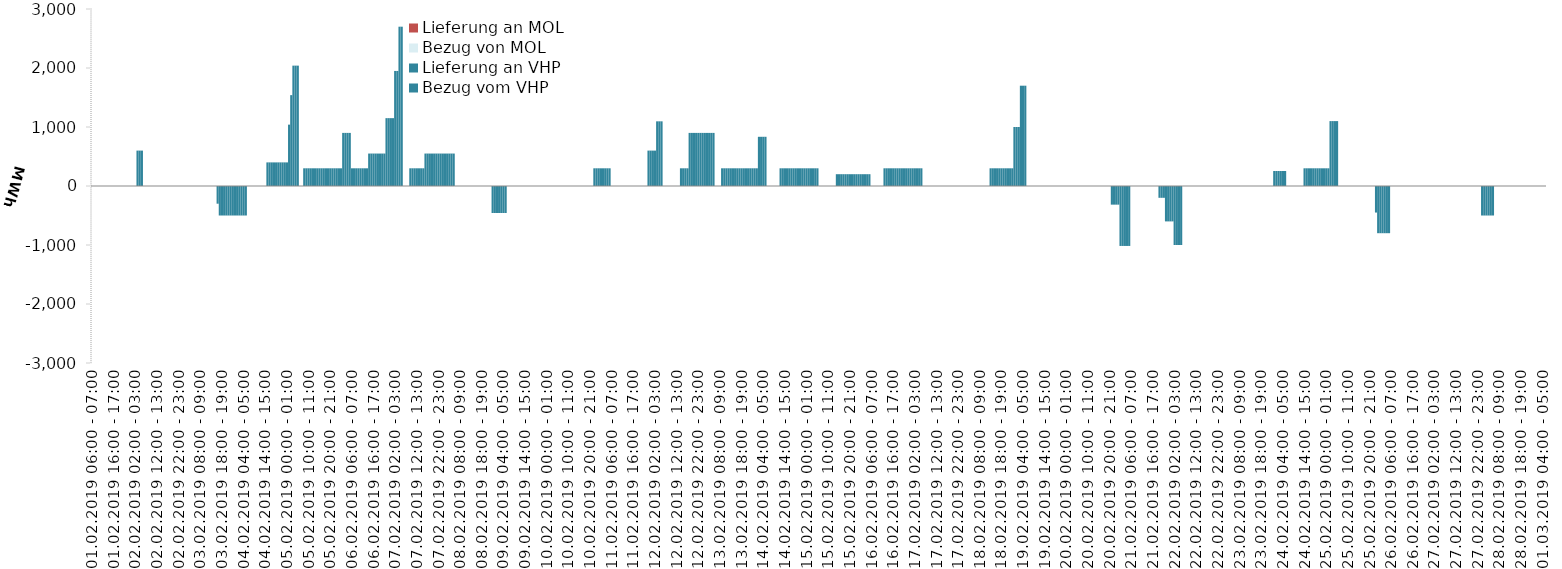
| Category | Bezug vom VHP | Lieferung an VHP | Bezug von MOL | Lieferung an MOL |
|---|---|---|---|---|
| 01.02.2019 06:00 - 07:00 | 0 | 0 | 0 | 0 |
| 01.02.2019 07:00 - 08:00 | 0 | 0 | 0 | 0 |
| 01.02.2019 08:00 - 09:00 | 0 | 0 | 0 | 0 |
| 01.02.2019 09:00 - 10:00 | 0 | 0 | 0 | 0 |
| 01.02.2019 10:00 - 11:00 | 0 | 0 | 0 | 0 |
| 01.02.2019 11:00 - 12:00 | 0 | 0 | 0 | 0 |
| 01.02.2019 12:00 - 13:00 | 0 | 0 | 0 | 0 |
| 01.02.2019 13:00 - 14:00 | 0 | 0 | 0 | 0 |
| 01.02.2019 14:00 - 15:00 | 0 | 0 | 0 | 0 |
| 01.02.2019 15:00 - 16:00 | 0 | 0 | 0 | 0 |
| 01.02.2019 16:00 - 17:00 | 0 | 0 | 0 | 0 |
| 01.02.2019 17:00 - 18:00 | 0 | 0 | 0 | 0 |
| 01.02.2019 18:00 - 19:00 | 0 | 0 | 0 | 0 |
| 01.02.2019 19:00 - 20:00 | 0 | 0 | 0 | 0 |
| 01.02.2019 20:00 - 21:00 | 0 | 0 | 0 | 0 |
| 01.02.2019 21:00 - 22:00 | 0 | 0 | 0 | 0 |
| 01.02.2019 22:00 - 23:00 | 0 | 0 | 0 | 0 |
| 01.02.2019 23:00 - 24:00 | 0 | 0 | 0 | 0 |
| 02.02.2019 00:00 - 01:00 | 0 | 0 | 0 | 0 |
| 02.02.2019 01:00 - 02:00 | 0 | 0 | 0 | 0 |
| 02.02.2019 02:00 - 03:00 | 0 | 0 | 0 | 0 |
| 02.02.2019 03:00 - 04:00 | 600 | 0 | 0 | 0 |
| 02.02.2019 04:00 - 05:00 | 600 | 0 | 0 | 0 |
| 02.02.2019 05:00 - 06:00 | 600 | 0 | 0 | 0 |
| 02.02.2019 06:00 - 07:00 | 0 | 0 | 0 | 0 |
| 02.02.2019 07:00 - 08:00 | 0 | 0 | 0 | 0 |
| 02.02.2019 08:00 - 09:00 | 0 | 0 | 0 | 0 |
| 02.02.2019 09:00 - 10:00 | 0 | 0 | 0 | 0 |
| 02.02.2019 10:00 - 11:00 | 0 | 0 | 0 | 0 |
| 02.02.2019 11:00 - 12:00 | 0 | 0 | 0 | 0 |
| 02.02.2019 12:00 - 13:00 | 0 | 0 | 0 | 0 |
| 02.02.2019 13:00 - 14:00 | 0 | 0 | 0 | 0 |
| 02.02.2019 14:00 - 15:00 | 0 | 0 | 0 | 0 |
| 02.02.2019 15:00 - 16:00 | 0 | 0 | 0 | 0 |
| 02.02.2019 16:00 - 17:00 | 0 | 0 | 0 | 0 |
| 02.02.2019 17:00 - 18:00 | 0 | 0 | 0 | 0 |
| 02.02.2019 18:00 - 19:00 | 0 | 0 | 0 | 0 |
| 02.02.2019 19:00 - 20:00 | 0 | 0 | 0 | 0 |
| 02.02.2019 20:00 - 21:00 | 0 | 0 | 0 | 0 |
| 02.02.2019 21:00 - 22:00 | 0 | 0 | 0 | 0 |
| 02.02.2019 22:00 - 23:00 | 0 | 0 | 0 | 0 |
| 02.02.2019 23:00 - 24:00 | 0 | 0 | 0 | 0 |
| 03.02.2019 00:00 - 01:00 | 0 | 0 | 0 | 0 |
| 03.02.2019 01:00 - 02:00 | 0 | 0 | 0 | 0 |
| 03.02.2019 02:00 - 03:00 | 0 | 0 | 0 | 0 |
| 03.02.2019 03:00 - 04:00 | 0 | 0 | 0 | 0 |
| 03.02.2019 04:00 - 05:00 | 0 | 0 | 0 | 0 |
| 03.02.2019 05:00 - 06:00 | 0 | 0 | 0 | 0 |
| 03.02.2019 06:00 - 07:00 | 0 | 0 | 0 | 0 |
| 03.02.2019 07:00 - 08:00 | 0 | 0 | 0 | 0 |
| 03.02.2019 08:00 - 09:00 | 0 | 0 | 0 | 0 |
| 03.02.2019 09:00 - 10:00 | 0 | 0 | 0 | 0 |
| 03.02.2019 10:00 - 11:00 | 0 | 0 | 0 | 0 |
| 03.02.2019 11:00 - 12:00 | 0 | 0 | 0 | 0 |
| 03.02.2019 12:00 - 13:00 | 0 | 0 | 0 | 0 |
| 03.02.2019 13:00 - 14:00 | 0 | 0 | 0 | 0 |
| 03.02.2019 14:00 - 15:00 | 0 | 0 | 0 | 0 |
| 03.02.2019 15:00 - 16:00 | 0 | 0 | 0 | 0 |
| 03.02.2019 16:00 - 17:00 | 0 | -300 | 0 | 0 |
| 03.02.2019 17:00 - 18:00 | 0 | -500 | 0 | 0 |
| 03.02.2019 18:00 - 19:00 | 0 | -500 | 0 | 0 |
| 03.02.2019 19:00 - 20:00 | 0 | -500 | 0 | 0 |
| 03.02.2019 20:00 - 21:00 | 0 | -500 | 0 | 0 |
| 03.02.2019 21:00 - 22:00 | 0 | -500 | 0 | 0 |
| 03.02.2019 22:00 - 23:00 | 0 | -500 | 0 | 0 |
| 03.02.2019 23:00 - 24:00 | 0 | -500 | 0 | 0 |
| 04.02.2019 00:00 - 01:00 | 0 | -500 | 0 | 0 |
| 04.02.2019 01:00 - 02:00 | 0 | -500 | 0 | 0 |
| 04.02.2019 02:00 - 03:00 | 0 | -500 | 0 | 0 |
| 04.02.2019 03:00 - 04:00 | 0 | -500 | 0 | 0 |
| 04.02.2019 04:00 - 05:00 | 0 | -500 | 0 | 0 |
| 04.02.2019 05:00 - 06:00 | 0 | -500 | 0 | 0 |
| 04.02.2019 06:00 - 07:00 | 0 | 0 | 0 | 0 |
| 04.02.2019 07:00 - 08:00 | 0 | 0 | 0 | 0 |
| 04.02.2019 08:00 - 09:00 | 0 | 0 | 0 | 0 |
| 04.02.2019 09:00 - 10:00 | 0 | 0 | 0 | 0 |
| 04.02.2019 10:00 - 11:00 | 0 | 0 | 0 | 0 |
| 04.02.2019 11:00 - 12:00 | 0 | 0 | 0 | 0 |
| 04.02.2019 12:00 - 13:00 | 0 | 0 | 0 | 0 |
| 04.02.2019 13:00 - 14:00 | 0 | 0 | 0 | 0 |
| 04.02.2019 14:00 - 15:00 | 0 | 0 | 0 | 0 |
| 04.02.2019 15:00 - 16:00 | 400 | 0 | 0 | 0 |
| 04.02.2019 16:00 - 17:00 | 400 | 0 | 0 | 0 |
| 04.02.2019 17:00 - 18:00 | 400 | 0 | 0 | 0 |
| 04.02.2019 18:00 - 19:00 | 400 | 0 | 0 | 0 |
| 04.02.2019 19:00 - 20:00 | 400 | 0 | 0 | 0 |
| 04.02.2019 20:00 - 21:00 | 400 | 0 | 0 | 0 |
| 04.02.2019 21:00 - 22:00 | 400 | 0 | 0 | 0 |
| 04.02.2019 22:00 - 23:00 | 400 | 0 | 0 | 0 |
| 04.02.2019 23:00 - 24:00 | 400 | 0 | 0 | 0 |
| 05.02.2019 00:00 - 01:00 | 400 | 0 | 0 | 0 |
| 05.02.2019 01:00 - 02:00 | 1040 | 0 | 0 | 0 |
| 05.02.2019 02:00 - 03:00 | 1540 | 0 | 0 | 0 |
| 05.02.2019 03:00 - 04:00 | 2040 | 0 | 0 | 0 |
| 05.02.2019 04:00 - 05:00 | 2040 | 0 | 0 | 0 |
| 05.02.2019 05:00 - 06:00 | 2040 | 0 | 0 | 0 |
| 05.02.2019 06:00 - 07:00 | 0 | 0 | 0 | 0 |
| 05.02.2019 07:00 - 08:00 | 0 | 0 | 0 | 0 |
| 05.02.2019 08:00 - 09:00 | 300 | 0 | 0 | 0 |
| 05.02.2019 09:00 - 10:00 | 300 | 0 | 0 | 0 |
| 05.02.2019 10:00 - 11:00 | 300 | 0 | 0 | 0 |
| 05.02.2019 11:00 - 12:00 | 300 | 0 | 0 | 0 |
| 05.02.2019 12:00 - 13:00 | 300 | 0 | 0 | 0 |
| 05.02.2019 13:00 - 14:00 | 300 | 0 | 0 | 0 |
| 05.02.2019 14:00 - 15:00 | 300 | 0 | 0 | 0 |
| 05.02.2019 15:00 - 16:00 | 300 | 0 | 0 | 0 |
| 05.02.2019 16:00 - 17:00 | 300 | 0 | 0 | 0 |
| 05.02.2019 17:00 - 18:00 | 300 | 0 | 0 | 0 |
| 05.02.2019 18:00 - 19:00 | 300 | 0 | 0 | 0 |
| 05.02.2019 19:00 - 20:00 | 300 | 0 | 0 | 0 |
| 05.02.2019 20:00 - 21:00 | 300 | 0 | 0 | 0 |
| 05.02.2019 21:00 - 22:00 | 300 | 0 | 0 | 0 |
| 05.02.2019 22:00 - 23:00 | 300 | 0 | 0 | 0 |
| 05.02.2019 23:00 - 24:00 | 300 | 0 | 0 | 0 |
| 06.02.2019 00:00 - 01:00 | 300 | 0 | 0 | 0 |
| 06.02.2019 01:00 - 02:00 | 300 | 0 | 0 | 0 |
| 06.02.2019 02:00 - 03:00 | 900 | 0 | 0 | 0 |
| 06.02.2019 03:00 - 04:00 | 900 | 0 | 0 | 0 |
| 06.02.2019 04:00 - 05:00 | 900 | 0 | 0 | 0 |
| 06.02.2019 05:00 - 06:00 | 900 | 0 | 0 | 0 |
| 06.02.2019 06:00 - 07:00 | 300 | 0 | 0 | 0 |
| 06.02.2019 07:00 - 08:00 | 300 | 0 | 0 | 0 |
| 06.02.2019 08:00 - 09:00 | 300 | 0 | 0 | 0 |
| 06.02.2019 09:00 - 10:00 | 300 | 0 | 0 | 0 |
| 06.02.2019 10:00 - 11:00 | 300 | 0 | 0 | 0 |
| 06.02.2019 11:00 - 12:00 | 300 | 0 | 0 | 0 |
| 06.02.2019 12:00 - 13:00 | 300 | 0 | 0 | 0 |
| 06.02.2019 13:00 - 14:00 | 300 | 0 | 0 | 0 |
| 06.02.2019 14:00 - 15:00 | 550 | 0 | 0 | 0 |
| 06.02.2019 15:00 - 16:00 | 550 | 0 | 0 | 0 |
| 06.02.2019 16:00 - 17:00 | 550 | 0 | 0 | 0 |
| 06.02.2019 17:00 - 18:00 | 550 | 0 | 0 | 0 |
| 06.02.2019 18:00 - 19:00 | 550 | 0 | 0 | 0 |
| 06.02.2019 19:00 - 20:00 | 550 | 0 | 0 | 0 |
| 06.02.2019 20:00 - 21:00 | 550 | 0 | 0 | 0 |
| 06.02.2019 21:00 - 22:00 | 550 | 0 | 0 | 0 |
| 06.02.2019 22:00 - 23:00 | 1150 | 0 | 0 | 0 |
| 06.02.2019 23:00 - 24:00 | 1150 | 0 | 0 | 0 |
| 07.02.2019 00:00 - 01:00 | 1150 | 0 | 0 | 0 |
| 07.02.2019 01:00 - 02:00 | 1150 | 0 | 0 | 0 |
| 07.02.2019 02:00 - 03:00 | 1950 | 0 | 0 | 0 |
| 07.02.2019 03:00 - 04:00 | 1950 | 0 | 0 | 0 |
| 07.02.2019 04:00 - 05:00 | 2700 | 0 | 0 | 0 |
| 07.02.2019 05:00 - 06:00 | 2700 | 0 | 0 | 0 |
| 07.02.2019 06:00 - 07:00 | 0 | 0 | 0 | 0 |
| 07.02.2019 07:00 - 08:00 | 0 | 0 | 0 | 0 |
| 07.02.2019 08:00 - 09:00 | 0 | 0 | 0 | 0 |
| 07.02.2019 09:00 - 10:00 | 300 | 0 | 0 | 0 |
| 07.02.2019 10:00 - 11:00 | 300 | 0 | 0 | 0 |
| 07.02.2019 11:00 - 12:00 | 300 | 0 | 0 | 0 |
| 07.02.2019 12:00 - 13:00 | 300 | 0 | 0 | 0 |
| 07.02.2019 13:00 - 14:00 | 300 | 0 | 0 | 0 |
| 07.02.2019 14:00 - 15:00 | 300 | 0 | 0 | 0 |
| 07.02.2019 15:00 - 16:00 | 300 | 0 | 0 | 0 |
| 07.02.2019 16:00 - 17:00 | 550 | 0 | 0 | 0 |
| 07.02.2019 17:00 - 18:00 | 550 | 0 | 0 | 0 |
| 07.02.2019 18:00 - 19:00 | 550 | 0 | 0 | 0 |
| 07.02.2019 19:00 - 20:00 | 550 | 0 | 0 | 0 |
| 07.02.2019 20:00 - 21:00 | 550 | 0 | 0 | 0 |
| 07.02.2019 21:00 - 22:00 | 550 | 0 | 0 | 0 |
| 07.02.2019 22:00 - 23:00 | 550 | 0 | 0 | 0 |
| 07.02.2019 23:00 - 24:00 | 550 | 0 | 0 | 0 |
| 08.02.2019 00:00 - 01:00 | 550 | 0 | 0 | 0 |
| 08.02.2019 01:00 - 02:00 | 550 | 0 | 0 | 0 |
| 08.02.2019 02:00 - 03:00 | 550 | 0 | 0 | 0 |
| 08.02.2019 03:00 - 04:00 | 550 | 0 | 0 | 0 |
| 08.02.2019 04:00 - 05:00 | 550 | 0 | 0 | 0 |
| 08.02.2019 05:00 - 06:00 | 550 | 0 | 0 | 0 |
| 08.02.2019 06:00 - 07:00 | 0 | 0 | 0 | 0 |
| 08.02.2019 07:00 - 08:00 | 0 | 0 | 0 | 0 |
| 08.02.2019 08:00 - 09:00 | 0 | 0 | 0 | 0 |
| 08.02.2019 09:00 - 10:00 | 0 | 0 | 0 | 0 |
| 08.02.2019 10:00 - 11:00 | 0 | 0 | 0 | 0 |
| 08.02.2019 11:00 - 12:00 | 0 | 0 | 0 | 0 |
| 08.02.2019 12:00 - 13:00 | 0 | 0 | 0 | 0 |
| 08.02.2019 13:00 - 14:00 | 0 | 0 | 0 | 0 |
| 08.02.2019 14:00 - 15:00 | 0 | 0 | 0 | 0 |
| 08.02.2019 15:00 - 16:00 | 0 | 0 | 0 | 0 |
| 08.02.2019 16:00 - 17:00 | 0 | 0 | 0 | 0 |
| 08.02.2019 17:00 - 18:00 | 0 | 0 | 0 | 0 |
| 08.02.2019 18:00 - 19:00 | 0 | 0 | 0 | 0 |
| 08.02.2019 19:00 - 20:00 | 0 | 0 | 0 | 0 |
| 08.02.2019 20:00 - 21:00 | 0 | 0 | 0 | 0 |
| 08.02.2019 21:00 - 22:00 | 0 | 0 | 0 | 0 |
| 08.02.2019 22:00 - 23:00 | 0 | 0 | 0 | 0 |
| 08.02.2019 23:00 - 24:00 | 0 | -458 | 0 | 0 |
| 09.02.2019 00:00 - 01:00 | 0 | -458 | 0 | 0 |
| 09.02.2019 01:00 - 02:00 | 0 | -458 | 0 | 0 |
| 09.02.2019 02:00 - 03:00 | 0 | -458 | 0 | 0 |
| 09.02.2019 03:00 - 04:00 | 0 | -458 | 0 | 0 |
| 09.02.2019 04:00 - 05:00 | 0 | -458 | 0 | 0 |
| 09.02.2019 05:00 - 06:00 | 0 | -458 | 0 | 0 |
| 09.02.2019 06:00 - 07:00 | 0 | 0 | 0 | 0 |
| 09.02.2019 07:00 - 08:00 | 0 | 0 | 0 | 0 |
| 09.02.2019 08:00 - 09:00 | 0 | 0 | 0 | 0 |
| 09.02.2019 09:00 - 10:00 | 0 | 0 | 0 | 0 |
| 09.02.2019 10:00 - 11:00 | 0 | 0 | 0 | 0 |
| 09.02.2019 11:00 - 12:00 | 0 | 0 | 0 | 0 |
| 09.02.2019 12:00 - 13:00 | 0 | 0 | 0 | 0 |
| 09.02.2019 13:00 - 14:00 | 0 | 0 | 0 | 0 |
| 09.02.2019 14:00 - 15:00 | 0 | 0 | 0 | 0 |
| 09.02.2019 15:00 - 16:00 | 0 | 0 | 0 | 0 |
| 09.02.2019 16:00 - 17:00 | 0 | 0 | 0 | 0 |
| 09.02.2019 17:00 - 18:00 | 0 | 0 | 0 | 0 |
| 09.02.2019 18:00 - 19:00 | 0 | 0 | 0 | 0 |
| 09.02.2019 19:00 - 20:00 | 0 | 0 | 0 | 0 |
| 09.02.2019 20:00 - 21:00 | 0 | 0 | 0 | 0 |
| 09.02.2019 21:00 - 22:00 | 0 | 0 | 0 | 0 |
| 09.02.2019 22:00 - 23:00 | 0 | 0 | 0 | 0 |
| 09.02.2019 23:00 - 24:00 | 0 | 0 | 0 | 0 |
| 10.02.2019 00:00 - 01:00 | 0 | 0 | 0 | 0 |
| 10.02.2019 01:00 - 02:00 | 0 | 0 | 0 | 0 |
| 10.02.2019 02:00 - 03:00 | 0 | 0 | 0 | 0 |
| 10.02.2019 03:00 - 04:00 | 0 | 0 | 0 | 0 |
| 10.02.2019 04:00 - 05:00 | 0 | 0 | 0 | 0 |
| 10.02.2019 05:00 - 06:00 | 0 | 0 | 0 | 0 |
| 10.02.2019 06:00 - 07:00 | 0 | 0 | 0 | 0 |
| 10.02.2019 07:00 - 08:00 | 0 | 0 | 0 | 0 |
| 10.02.2019 08:00 - 09:00 | 0 | 0 | 0 | 0 |
| 10.02.2019 09:00 - 10:00 | 0 | 0 | 0 | 0 |
| 10.02.2019 10:00 - 11:00 | 0 | 0 | 0 | 0 |
| 10.02.2019 11:00 - 12:00 | 0 | 0 | 0 | 0 |
| 10.02.2019 12:00 - 13:00 | 0 | 0 | 0 | 0 |
| 10.02.2019 13:00 - 14:00 | 0 | 0 | 0 | 0 |
| 10.02.2019 14:00 - 15:00 | 0 | 0 | 0 | 0 |
| 10.02.2019 15:00 - 16:00 | 0 | 0 | 0 | 0 |
| 10.02.2019 16:00 - 17:00 | 0 | 0 | 0 | 0 |
| 10.02.2019 17:00 - 18:00 | 0 | 0 | 0 | 0 |
| 10.02.2019 18:00 - 19:00 | 0 | 0 | 0 | 0 |
| 10.02.2019 19:00 - 20:00 | 0 | 0 | 0 | 0 |
| 10.02.2019 20:00 - 21:00 | 0 | 0 | 0 | 0 |
| 10.02.2019 21:00 - 22:00 | 0 | 0 | 0 | 0 |
| 10.02.2019 22:00 - 23:00 | 300 | 0 | 0 | 0 |
| 10.02.2019 23:00 - 24:00 | 300 | 0 | 0 | 0 |
| 11.02.2019 00:00 - 01:00 | 300 | 0 | 0 | 0 |
| 11.02.2019 01:00 - 02:00 | 300 | 0 | 0 | 0 |
| 11.02.2019 02:00 - 03:00 | 300 | 0 | 0 | 0 |
| 11.02.2019 03:00 - 04:00 | 300 | 0 | 0 | 0 |
| 11.02.2019 04:00 - 05:00 | 300 | 0 | 0 | 0 |
| 11.02.2019 05:00 - 06:00 | 300 | 0 | 0 | 0 |
| 11.02.2019 06:00 - 07:00 | 0 | 0 | 0 | 0 |
| 11.02.2019 07:00 - 08:00 | 0 | 0 | 0 | 0 |
| 11.02.2019 08:00 - 09:00 | 0 | 0 | 0 | 0 |
| 11.02.2019 09:00 - 10:00 | 0 | 0 | 0 | 0 |
| 11.02.2019 10:00 - 11:00 | 0 | 0 | 0 | 0 |
| 11.02.2019 11:00 - 12:00 | 0 | 0 | 0 | 0 |
| 11.02.2019 12:00 - 13:00 | 0 | 0 | 0 | 0 |
| 11.02.2019 13:00 - 14:00 | 0 | 0 | 0 | 0 |
| 11.02.2019 14:00 - 15:00 | 0 | 0 | 0 | 0 |
| 11.02.2019 15:00 - 16:00 | 0 | 0 | 0 | 0 |
| 11.02.2019 16:00 - 17:00 | 0 | 0 | 0 | 0 |
| 11.02.2019 17:00 - 18:00 | 0 | 0 | 0 | 0 |
| 11.02.2019 18:00 - 19:00 | 0 | 0 | 0 | 0 |
| 11.02.2019 19:00 - 20:00 | 0 | 0 | 0 | 0 |
| 11.02.2019 20:00 - 21:00 | 0 | 0 | 0 | 0 |
| 11.02.2019 21:00 - 22:00 | 0 | 0 | 0 | 0 |
| 11.02.2019 22:00 - 23:00 | 0 | 0 | 0 | 0 |
| 11.02.2019 23:00 - 24:00 | 600 | 0 | 0 | 0 |
| 12.02.2019 00:00 - 01:00 | 600 | 0 | 0 | 0 |
| 12.02.2019 01:00 - 02:00 | 600 | 0 | 0 | 0 |
| 12.02.2019 02:00 - 03:00 | 600 | 0 | 0 | 0 |
| 12.02.2019 03:00 - 04:00 | 1096 | 0 | 0 | 0 |
| 12.02.2019 04:00 - 05:00 | 1096 | 0 | 0 | 0 |
| 12.02.2019 05:00 - 06:00 | 1096 | 0 | 0 | 0 |
| 12.02.2019 06:00 - 07:00 | 0 | 0 | 0 | 0 |
| 12.02.2019 07:00 - 08:00 | 0 | 0 | 0 | 0 |
| 12.02.2019 08:00 - 09:00 | 0 | 0 | 0 | 0 |
| 12.02.2019 09:00 - 10:00 | 0 | 0 | 0 | 0 |
| 12.02.2019 10:00 - 11:00 | 0 | 0 | 0 | 0 |
| 12.02.2019 11:00 - 12:00 | 0 | 0 | 0 | 0 |
| 12.02.2019 12:00 - 13:00 | 0 | 0 | 0 | 0 |
| 12.02.2019 13:00 - 14:00 | 0 | 0 | 0 | 0 |
| 12.02.2019 14:00 - 15:00 | 300 | 0 | 0 | 0 |
| 12.02.2019 15:00 - 16:00 | 300 | 0 | 0 | 0 |
| 12.02.2019 16:00 - 17:00 | 300 | 0 | 0 | 0 |
| 12.02.2019 17:00 - 18:00 | 300 | 0 | 0 | 0 |
| 12.02.2019 18:00 - 19:00 | 900 | 0 | 0 | 0 |
| 12.02.2019 19:00 - 20:00 | 900 | 0 | 0 | 0 |
| 12.02.2019 20:00 - 21:00 | 900 | 0 | 0 | 0 |
| 12.02.2019 21:00 - 22:00 | 900 | 0 | 0 | 0 |
| 12.02.2019 22:00 - 23:00 | 900 | 0 | 0 | 0 |
| 12.02.2019 23:00 - 24:00 | 900 | 0 | 0 | 0 |
| 13.02.2019 00:00 - 01:00 | 900 | 0 | 0 | 0 |
| 13.02.2019 01:00 - 02:00 | 900 | 0 | 0 | 0 |
| 13.02.2019 02:00 - 03:00 | 900 | 0 | 0 | 0 |
| 13.02.2019 03:00 - 04:00 | 900 | 0 | 0 | 0 |
| 13.02.2019 04:00 - 05:00 | 900 | 0 | 0 | 0 |
| 13.02.2019 05:00 - 06:00 | 900 | 0 | 0 | 0 |
| 13.02.2019 06:00 - 07:00 | 0 | 0 | 0 | 0 |
| 13.02.2019 07:00 - 08:00 | 0 | 0 | 0 | 0 |
| 13.02.2019 08:00 - 09:00 | 0 | 0 | 0 | 0 |
| 13.02.2019 09:00 - 10:00 | 300 | 0 | 0 | 0 |
| 13.02.2019 10:00 - 11:00 | 300 | 0 | 0 | 0 |
| 13.02.2019 11:00 - 12:00 | 300 | 0 | 0 | 0 |
| 13.02.2019 12:00 - 13:00 | 300 | 0 | 0 | 0 |
| 13.02.2019 13:00 - 14:00 | 300 | 0 | 0 | 0 |
| 13.02.2019 14:00 - 15:00 | 300 | 0 | 0 | 0 |
| 13.02.2019 15:00 - 16:00 | 300 | 0 | 0 | 0 |
| 13.02.2019 16:00 - 17:00 | 300 | 0 | 0 | 0 |
| 13.02.2019 17:00 - 18:00 | 300 | 0 | 0 | 0 |
| 13.02.2019 18:00 - 19:00 | 300 | 0 | 0 | 0 |
| 13.02.2019 19:00 - 20:00 | 300 | 0 | 0 | 0 |
| 13.02.2019 20:00 - 21:00 | 300 | 0 | 0 | 0 |
| 13.02.2019 21:00 - 22:00 | 300 | 0 | 0 | 0 |
| 13.02.2019 22:00 - 23:00 | 300 | 0 | 0 | 0 |
| 13.02.2019 23:00 - 24:00 | 300 | 0 | 0 | 0 |
| 14.02.2019 00:00 - 01:00 | 300 | 0 | 0 | 0 |
| 14.02.2019 01:00 - 02:00 | 300 | 0 | 0 | 0 |
| 14.02.2019 02:00 - 03:00 | 834 | 0 | 0 | 0 |
| 14.02.2019 03:00 - 04:00 | 834 | 0 | 0 | 0 |
| 14.02.2019 04:00 - 05:00 | 834 | 0 | 0 | 0 |
| 14.02.2019 05:00 - 06:00 | 834 | 0 | 0 | 0 |
| 14.02.2019 06:00 - 07:00 | 0 | 0 | 0 | 0 |
| 14.02.2019 07:00 - 08:00 | 0 | 0 | 0 | 0 |
| 14.02.2019 08:00 - 09:00 | 0 | 0 | 0 | 0 |
| 14.02.2019 09:00 - 10:00 | 0 | 0 | 0 | 0 |
| 14.02.2019 10:00 - 11:00 | 0 | 0 | 0 | 0 |
| 14.02.2019 11:00 - 12:00 | 0 | 0 | 0 | 0 |
| 14.02.2019 12:00 - 13:00 | 300 | 0 | 0 | 0 |
| 14.02.2019 13:00 - 14:00 | 300 | 0 | 0 | 0 |
| 14.02.2019 14:00 - 15:00 | 300 | 0 | 0 | 0 |
| 14.02.2019 15:00 - 16:00 | 300 | 0 | 0 | 0 |
| 14.02.2019 16:00 - 17:00 | 300 | 0 | 0 | 0 |
| 14.02.2019 17:00 - 18:00 | 300 | 0 | 0 | 0 |
| 14.02.2019 18:00 - 19:00 | 300 | 0 | 0 | 0 |
| 14.02.2019 19:00 - 20:00 | 300 | 0 | 0 | 0 |
| 14.02.2019 20:00 - 21:00 | 300 | 0 | 0 | 0 |
| 14.02.2019 21:00 - 22:00 | 300 | 0 | 0 | 0 |
| 14.02.2019 22:00 - 23:00 | 300 | 0 | 0 | 0 |
| 14.02.2019 23:00 - 24:00 | 300 | 0 | 0 | 0 |
| 15.02.2019 00:00 - 01:00 | 300 | 0 | 0 | 0 |
| 15.02.2019 01:00 - 02:00 | 300 | 0 | 0 | 0 |
| 15.02.2019 02:00 - 03:00 | 300 | 0 | 0 | 0 |
| 15.02.2019 03:00 - 04:00 | 300 | 0 | 0 | 0 |
| 15.02.2019 04:00 - 05:00 | 300 | 0 | 0 | 0 |
| 15.02.2019 05:00 - 06:00 | 300 | 0 | 0 | 0 |
| 15.02.2019 06:00 - 07:00 | 0 | 0 | 0 | 0 |
| 15.02.2019 07:00 - 08:00 | 0 | 0 | 0 | 0 |
| 15.02.2019 08:00 - 09:00 | 0 | 0 | 0 | 0 |
| 15.02.2019 09:00 - 10:00 | 0 | 0 | 0 | 0 |
| 15.02.2019 10:00 - 11:00 | 0 | 0 | 0 | 0 |
| 15.02.2019 11:00 - 12:00 | 0 | 0 | 0 | 0 |
| 15.02.2019 12:00 - 13:00 | 0 | 0 | 0 | 0 |
| 15.02.2019 13:00 - 14:00 | 0 | 0 | 0 | 0 |
| 15.02.2019 14:00 - 15:00 | 200 | 0 | 0 | 0 |
| 15.02.2019 15:00 - 16:00 | 200 | 0 | 0 | 0 |
| 15.02.2019 16:00 - 17:00 | 200 | 0 | 0 | 0 |
| 15.02.2019 17:00 - 18:00 | 200 | 0 | 0 | 0 |
| 15.02.2019 18:00 - 19:00 | 200 | 0 | 0 | 0 |
| 15.02.2019 19:00 - 20:00 | 200 | 0 | 0 | 0 |
| 15.02.2019 20:00 - 21:00 | 200 | 0 | 0 | 0 |
| 15.02.2019 21:00 - 22:00 | 200 | 0 | 0 | 0 |
| 15.02.2019 22:00 - 23:00 | 200 | 0 | 0 | 0 |
| 15.02.2019 23:00 - 24:00 | 200 | 0 | 0 | 0 |
| 16.02.2019 00:00 - 01:00 | 200 | 0 | 0 | 0 |
| 16.02.2019 01:00 - 02:00 | 200 | 0 | 0 | 0 |
| 16.02.2019 02:00 - 03:00 | 200 | 0 | 0 | 0 |
| 16.02.2019 03:00 - 04:00 | 200 | 0 | 0 | 0 |
| 16.02.2019 04:00 - 05:00 | 200 | 0 | 0 | 0 |
| 16.02.2019 05:00 - 06:00 | 200 | 0 | 0 | 0 |
| 16.02.2019 06:00 - 07:00 | 0 | 0 | 0 | 0 |
| 16.02.2019 07:00 - 08:00 | 0 | 0 | 0 | 0 |
| 16.02.2019 08:00 - 09:00 | 0 | 0 | 0 | 0 |
| 16.02.2019 09:00 - 10:00 | 0 | 0 | 0 | 0 |
| 16.02.2019 10:00 - 11:00 | 0 | 0 | 0 | 0 |
| 16.02.2019 11:00 - 12:00 | 0 | 0 | 0 | 0 |
| 16.02.2019 12:00 - 13:00 | 300 | 0 | 0 | 0 |
| 16.02.2019 13:00 - 14:00 | 300 | 0 | 0 | 0 |
| 16.02.2019 14:00 - 15:00 | 300 | 0 | 0 | 0 |
| 16.02.2019 15:00 - 16:00 | 300 | 0 | 0 | 0 |
| 16.02.2019 16:00 - 17:00 | 300 | 0 | 0 | 0 |
| 16.02.2019 17:00 - 18:00 | 300 | 0 | 0 | 0 |
| 16.02.2019 18:00 - 19:00 | 300 | 0 | 0 | 0 |
| 16.02.2019 19:00 - 20:00 | 300 | 0 | 0 | 0 |
| 16.02.2019 20:00 - 21:00 | 300 | 0 | 0 | 0 |
| 16.02.2019 21:00 - 22:00 | 300 | 0 | 0 | 0 |
| 16.02.2019 22:00 - 23:00 | 300 | 0 | 0 | 0 |
| 16.02.2019 23:00 - 24:00 | 300 | 0 | 0 | 0 |
| 17.02.2019 00:00 - 01:00 | 300 | 0 | 0 | 0 |
| 17.02.2019 01:00 - 02:00 | 300 | 0 | 0 | 0 |
| 17.02.2019 02:00 - 03:00 | 300 | 0 | 0 | 0 |
| 17.02.2019 03:00 - 04:00 | 300 | 0 | 0 | 0 |
| 17.02.2019 04:00 - 05:00 | 300 | 0 | 0 | 0 |
| 17.02.2019 05:00 - 06:00 | 300 | 0 | 0 | 0 |
| 17.02.2019 06:00 - 07:00 | 0 | 0 | 0 | 0 |
| 17.02.2019 07:00 - 08:00 | 0 | 0 | 0 | 0 |
| 17.02.2019 08:00 - 09:00 | 0 | 0 | 0 | 0 |
| 17.02.2019 09:00 - 10:00 | 0 | 0 | 0 | 0 |
| 17.02.2019 10:00 - 11:00 | 0 | 0 | 0 | 0 |
| 17.02.2019 11:00 - 12:00 | 0 | 0 | 0 | 0 |
| 17.02.2019 12:00 - 13:00 | 0 | 0 | 0 | 0 |
| 17.02.2019 13:00 - 14:00 | 0 | 0 | 0 | 0 |
| 17.02.2019 14:00 - 15:00 | 0 | 0 | 0 | 0 |
| 17.02.2019 15:00 - 16:00 | 0 | 0 | 0 | 0 |
| 17.02.2019 16:00 - 17:00 | 0 | 0 | 0 | 0 |
| 17.02.2019 17:00 - 18:00 | 0 | 0 | 0 | 0 |
| 17.02.2019 18:00 - 19:00 | 0 | 0 | 0 | 0 |
| 17.02.2019 19:00 - 20:00 | 0 | 0 | 0 | 0 |
| 17.02.2019 20:00 - 21:00 | 0 | 0 | 0 | 0 |
| 17.02.2019 21:00 - 22:00 | 0 | 0 | 0 | 0 |
| 17.02.2019 22:00 - 23:00 | 0 | 0 | 0 | 0 |
| 17.02.2019 23:00 - 24:00 | 0 | 0 | 0 | 0 |
| 18.02.2019 00:00 - 01:00 | 0 | 0 | 0 | 0 |
| 18.02.2019 01:00 - 02:00 | 0 | 0 | 0 | 0 |
| 18.02.2019 02:00 - 03:00 | 0 | 0 | 0 | 0 |
| 18.02.2019 03:00 - 04:00 | 0 | 0 | 0 | 0 |
| 18.02.2019 04:00 - 05:00 | 0 | 0 | 0 | 0 |
| 18.02.2019 05:00 - 06:00 | 0 | 0 | 0 | 0 |
| 18.02.2019 06:00 - 07:00 | 0 | 0 | 0 | 0 |
| 18.02.2019 07:00 - 08:00 | 0 | 0 | 0 | 0 |
| 18.02.2019 08:00 - 09:00 | 0 | 0 | 0 | 0 |
| 18.02.2019 09:00 - 10:00 | 0 | 0 | 0 | 0 |
| 18.02.2019 10:00 - 11:00 | 0 | 0 | 0 | 0 |
| 18.02.2019 11:00 - 12:00 | 0 | 0 | 0 | 0 |
| 18.02.2019 12:00 - 13:00 | 0 | 0 | 0 | 0 |
| 18.02.2019 13:00 - 14:00 | 300 | 0 | 0 | 0 |
| 18.02.2019 14:00 - 15:00 | 300 | 0 | 0 | 0 |
| 18.02.2019 15:00 - 16:00 | 300 | 0 | 0 | 0 |
| 18.02.2019 16:00 - 17:00 | 300 | 0 | 0 | 0 |
| 18.02.2019 17:00 - 18:00 | 300 | 0 | 0 | 0 |
| 18.02.2019 18:00 - 19:00 | 300 | 0 | 0 | 0 |
| 18.02.2019 19:00 - 20:00 | 300 | 0 | 0 | 0 |
| 18.02.2019 20:00 - 21:00 | 300 | 0 | 0 | 0 |
| 18.02.2019 21:00 - 22:00 | 300 | 0 | 0 | 0 |
| 18.02.2019 22:00 - 23:00 | 300 | 0 | 0 | 0 |
| 18.02.2019 23:00 - 24:00 | 300 | 0 | 0 | 0 |
| 19.02.2019 00:00 - 01:00 | 1000 | 0 | 0 | 0 |
| 19.02.2019 01:00 - 02:00 | 1000 | 0 | 0 | 0 |
| 19.02.2019 02:00 - 03:00 | 1000 | 0 | 0 | 0 |
| 19.02.2019 03:00 - 04:00 | 1700 | 0 | 0 | 0 |
| 19.02.2019 04:00 - 05:00 | 1700 | 0 | 0 | 0 |
| 19.02.2019 05:00 - 06:00 | 1700 | 0 | 0 | 0 |
| 19.02.2019 06:00 - 07:00 | 0 | 0 | 0 | 0 |
| 19.02.2019 07:00 - 08:00 | 0 | 0 | 0 | 0 |
| 19.02.2019 08:00 - 09:00 | 0 | 0 | 0 | 0 |
| 19.02.2019 09:00 - 10:00 | 0 | 0 | 0 | 0 |
| 19.02.2019 10:00 - 11:00 | 0 | 0 | 0 | 0 |
| 19.02.2019 11:00 - 12:00 | 0 | 0 | 0 | 0 |
| 19.02.2019 12:00 - 13:00 | 0 | 0 | 0 | 0 |
| 19.02.2019 13:00 - 14:00 | 0 | 0 | 0 | 0 |
| 19.02.2019 14:00 - 15:00 | 0 | 0 | 0 | 0 |
| 19.02.2019 15:00 - 16:00 | 0 | 0 | 0 | 0 |
| 19.02.2019 16:00 - 17:00 | 0 | 0 | 0 | 0 |
| 19.02.2019 17:00 - 18:00 | 0 | 0 | 0 | 0 |
| 19.02.2019 18:00 - 19:00 | 0 | 0 | 0 | 0 |
| 19.02.2019 19:00 - 20:00 | 0 | 0 | 0 | 0 |
| 19.02.2019 20:00 - 21:00 | 0 | 0 | 0 | 0 |
| 19.02.2019 21:00 - 22:00 | 0 | 0 | 0 | 0 |
| 19.02.2019 22:00 - 23:00 | 0 | 0 | 0 | 0 |
| 19.02.2019 23:00 - 24:00 | 0 | 0 | 0 | 0 |
| 20.02.2019 00:00 - 01:00 | 0 | 0 | 0 | 0 |
| 20.02.2019 01:00 - 02:00 | 0 | 0 | 0 | 0 |
| 20.02.2019 02:00 - 03:00 | 0 | 0 | 0 | 0 |
| 20.02.2019 03:00 - 04:00 | 0 | 0 | 0 | 0 |
| 20.02.2019 04:00 - 05:00 | 0 | 0 | 0 | 0 |
| 20.02.2019 05:00 - 06:00 | 0 | 0 | 0 | 0 |
| 20.02.2019 06:00 - 07:00 | 0 | 0 | 0 | 0 |
| 20.02.2019 07:00 - 08:00 | 0 | 0 | 0 | 0 |
| 20.02.2019 08:00 - 09:00 | 0 | 0 | 0 | 0 |
| 20.02.2019 09:00 - 10:00 | 0 | 0 | 0 | 0 |
| 20.02.2019 10:00 - 11:00 | 0 | 0 | 0 | 0 |
| 20.02.2019 11:00 - 12:00 | 0 | 0 | 0 | 0 |
| 20.02.2019 12:00 - 13:00 | 0 | 0 | 0 | 0 |
| 20.02.2019 13:00 - 14:00 | 0 | 0 | 0 | 0 |
| 20.02.2019 14:00 - 15:00 | 0 | 0 | 0 | 0 |
| 20.02.2019 15:00 - 16:00 | 0 | 0 | 0 | 0 |
| 20.02.2019 16:00 - 17:00 | 0 | 0 | 0 | 0 |
| 20.02.2019 17:00 - 18:00 | 0 | 0 | 0 | 0 |
| 20.02.2019 18:00 - 19:00 | 0 | 0 | 0 | 0 |
| 20.02.2019 19:00 - 20:00 | 0 | 0 | 0 | 0 |
| 20.02.2019 20:00 - 21:00 | 0 | 0 | 0 | 0 |
| 20.02.2019 21:00 - 22:00 | 0 | -316 | 0 | 0 |
| 20.02.2019 22:00 - 23:00 | 0 | -316 | 0 | 0 |
| 20.02.2019 23:00 - 24:00 | 0 | -316 | 0 | 0 |
| 21.02.2019 00:00 - 01:00 | 0 | -316 | 0 | 0 |
| 21.02.2019 01:00 - 02:00 | 0 | -1016 | 0 | 0 |
| 21.02.2019 02:00 - 03:00 | 0 | -1016 | 0 | 0 |
| 21.02.2019 03:00 - 04:00 | 0 | -1016 | 0 | 0 |
| 21.02.2019 04:00 - 05:00 | 0 | -1016 | 0 | 0 |
| 21.02.2019 05:00 - 06:00 | 0 | -1016 | 0 | 0 |
| 21.02.2019 06:00 - 07:00 | 0 | 0 | 0 | 0 |
| 21.02.2019 07:00 - 08:00 | 0 | 0 | 0 | 0 |
| 21.02.2019 08:00 - 09:00 | 0 | 0 | 0 | 0 |
| 21.02.2019 09:00 - 10:00 | 0 | 0 | 0 | 0 |
| 21.02.2019 10:00 - 11:00 | 0 | 0 | 0 | 0 |
| 21.02.2019 11:00 - 12:00 | 0 | 0 | 0 | 0 |
| 21.02.2019 12:00 - 13:00 | 0 | 0 | 0 | 0 |
| 21.02.2019 13:00 - 14:00 | 0 | 0 | 0 | 0 |
| 21.02.2019 14:00 - 15:00 | 0 | 0 | 0 | 0 |
| 21.02.2019 15:00 - 16:00 | 0 | 0 | 0 | 0 |
| 21.02.2019 16:00 - 17:00 | 0 | 0 | 0 | 0 |
| 21.02.2019 17:00 - 18:00 | 0 | 0 | 0 | 0 |
| 21.02.2019 18:00 - 19:00 | 0 | 0 | 0 | 0 |
| 21.02.2019 19:00 - 20:00 | 0 | -200 | 0 | 0 |
| 21.02.2019 20:00 - 21:00 | 0 | -200 | 0 | 0 |
| 21.02.2019 21:00 - 22:00 | 0 | -200 | 0 | 0 |
| 21.02.2019 22:00 - 23:00 | 0 | -600 | 0 | 0 |
| 21.02.2019 23:00 - 24:00 | 0 | -600 | 0 | 0 |
| 22.02.2019 00:00 - 01:00 | 0 | -600 | 0 | 0 |
| 22.02.2019 01:00 - 02:00 | 0 | -600 | 0 | 0 |
| 22.02.2019 02:00 - 03:00 | 0 | -1000 | 0 | 0 |
| 22.02.2019 03:00 - 04:00 | 0 | -1000 | 0 | 0 |
| 22.02.2019 04:00 - 05:00 | 0 | -1000 | 0 | 0 |
| 22.02.2019 05:00 - 06:00 | 0 | -1000 | 0 | 0 |
| 22.02.2019 06:00 - 07:00 | 0 | 0 | 0 | 0 |
| 22.02.2019 07:00 - 08:00 | 0 | 0 | 0 | 0 |
| 22.02.2019 08:00 - 09:00 | 0 | 0 | 0 | 0 |
| 22.02.2019 09:00 - 10:00 | 0 | 0 | 0 | 0 |
| 22.02.2019 10:00 - 11:00 | 0 | 0 | 0 | 0 |
| 22.02.2019 11:00 - 12:00 | 0 | 0 | 0 | 0 |
| 22.02.2019 12:00 - 13:00 | 0 | 0 | 0 | 0 |
| 22.02.2019 13:00 - 14:00 | 0 | 0 | 0 | 0 |
| 22.02.2019 14:00 - 15:00 | 0 | 0 | 0 | 0 |
| 22.02.2019 15:00 - 16:00 | 0 | 0 | 0 | 0 |
| 22.02.2019 16:00 - 17:00 | 0 | 0 | 0 | 0 |
| 22.02.2019 17:00 - 18:00 | 0 | 0 | 0 | 0 |
| 22.02.2019 18:00 - 19:00 | 0 | 0 | 0 | 0 |
| 22.02.2019 19:00 - 20:00 | 0 | 0 | 0 | 0 |
| 22.02.2019 20:00 - 21:00 | 0 | 0 | 0 | 0 |
| 22.02.2019 21:00 - 22:00 | 0 | 0 | 0 | 0 |
| 22.02.2019 22:00 - 23:00 | 0 | 0 | 0 | 0 |
| 22.02.2019 23:00 - 24:00 | 0 | 0 | 0 | 0 |
| 23.02.2019 00:00 - 01:00 | 0 | 0 | 0 | 0 |
| 23.02.2019 01:00 - 02:00 | 0 | 0 | 0 | 0 |
| 23.02.2019 02:00 - 03:00 | 0 | 0 | 0 | 0 |
| 23.02.2019 03:00 - 04:00 | 0 | 0 | 0 | 0 |
| 23.02.2019 04:00 - 05:00 | 0 | 0 | 0 | 0 |
| 23.02.2019 05:00 - 06:00 | 0 | 0 | 0 | 0 |
| 23.02.2019 06:00 - 07:00 | 0 | 0 | 0 | 0 |
| 23.02.2019 07:00 - 08:00 | 0 | 0 | 0 | 0 |
| 23.02.2019 08:00 - 09:00 | 0 | 0 | 0 | 0 |
| 23.02.2019 09:00 - 10:00 | 0 | 0 | 0 | 0 |
| 23.02.2019 10:00 - 11:00 | 0 | 0 | 0 | 0 |
| 23.02.2019 11:00 - 12:00 | 0 | 0 | 0 | 0 |
| 23.02.2019 12:00 - 13:00 | 0 | 0 | 0 | 0 |
| 23.02.2019 13:00 - 14:00 | 0 | 0 | 0 | 0 |
| 23.02.2019 14:00 - 15:00 | 0 | 0 | 0 | 0 |
| 23.02.2019 15:00 - 16:00 | 0 | 0 | 0 | 0 |
| 23.02.2019 16:00 - 17:00 | 0 | 0 | 0 | 0 |
| 23.02.2019 17:00 - 18:00 | 0 | 0 | 0 | 0 |
| 23.02.2019 18:00 - 19:00 | 0 | 0 | 0 | 0 |
| 23.02.2019 19:00 - 20:00 | 0 | 0 | 0 | 0 |
| 23.02.2019 20:00 - 21:00 | 0 | 0 | 0 | 0 |
| 23.02.2019 21:00 - 22:00 | 0 | 0 | 0 | 0 |
| 23.02.2019 22:00 - 23:00 | 0 | 0 | 0 | 0 |
| 23.02.2019 23:00 - 24:00 | 0 | 0 | 0 | 0 |
| 24.02.2019 00:00 - 01:00 | 254 | 0 | 0 | 0 |
| 24.02.2019 01:00 - 02:00 | 254 | 0 | 0 | 0 |
| 24.02.2019 02:00 - 03:00 | 254 | 0 | 0 | 0 |
| 24.02.2019 03:00 - 04:00 | 254 | 0 | 0 | 0 |
| 24.02.2019 04:00 - 05:00 | 254 | 0 | 0 | 0 |
| 24.02.2019 05:00 - 06:00 | 254 | 0 | 0 | 0 |
| 24.02.2019 06:00 - 07:00 | 0 | 0 | 0 | 0 |
| 24.02.2019 07:00 - 08:00 | 0 | 0 | 0 | 0 |
| 24.02.2019 08:00 - 09:00 | 0 | 0 | 0 | 0 |
| 24.02.2019 09:00 - 10:00 | 0 | 0 | 0 | 0 |
| 24.02.2019 10:00 - 11:00 | 0 | 0 | 0 | 0 |
| 24.02.2019 11:00 - 12:00 | 0 | 0 | 0 | 0 |
| 24.02.2019 12:00 - 13:00 | 0 | 0 | 0 | 0 |
| 24.02.2019 13:00 - 14:00 | 0 | 0 | 0 | 0 |
| 24.02.2019 14:00 - 15:00 | 300 | 0 | 0 | 0 |
| 24.02.2019 15:00 - 16:00 | 300 | 0 | 0 | 0 |
| 24.02.2019 16:00 - 17:00 | 300 | 0 | 0 | 0 |
| 24.02.2019 17:00 - 18:00 | 300 | 0 | 0 | 0 |
| 24.02.2019 18:00 - 19:00 | 300 | 0 | 0 | 0 |
| 24.02.2019 19:00 - 20:00 | 300 | 0 | 0 | 0 |
| 24.02.2019 20:00 - 21:00 | 300 | 0 | 0 | 0 |
| 24.02.2019 21:00 - 22:00 | 300 | 0 | 0 | 0 |
| 24.02.2019 22:00 - 23:00 | 300 | 0 | 0 | 0 |
| 24.02.2019 23:00 - 24:00 | 300 | 0 | 0 | 0 |
| 25.02.2019 00:00 - 01:00 | 300 | 0 | 0 | 0 |
| 25.02.2019 01:00 - 02:00 | 300 | 0 | 0 | 0 |
| 25.02.2019 02:00 - 03:00 | 1100 | 0 | 0 | 0 |
| 25.02.2019 03:00 - 04:00 | 1100 | 0 | 0 | 0 |
| 25.02.2019 04:00 - 05:00 | 1100 | 0 | 0 | 0 |
| 25.02.2019 05:00 - 06:00 | 1100 | 0 | 0 | 0 |
| 25.02.2019 06:00 - 07:00 | 0 | 0 | 0 | 0 |
| 25.02.2019 07:00 - 08:00 | 0 | 0 | 0 | 0 |
| 25.02.2019 08:00 - 09:00 | 0 | 0 | 0 | 0 |
| 25.02.2019 09:00 - 10:00 | 0 | 0 | 0 | 0 |
| 25.02.2019 10:00 - 11:00 | 0 | 0 | 0 | 0 |
| 25.02.2019 11:00 - 12:00 | 0 | 0 | 0 | 0 |
| 25.02.2019 12:00 - 13:00 | 0 | 0 | 0 | 0 |
| 25.02.2019 13:00 - 14:00 | 0 | 0 | 0 | 0 |
| 25.02.2019 14:00 - 15:00 | 0 | 0 | 0 | 0 |
| 25.02.2019 15:00 - 16:00 | 0 | 0 | 0 | 0 |
| 25.02.2019 16:00 - 17:00 | 0 | 0 | 0 | 0 |
| 25.02.2019 17:00 - 18:00 | 0 | 0 | 0 | 0 |
| 25.02.2019 18:00 - 19:00 | 0 | 0 | 0 | 0 |
| 25.02.2019 19:00 - 20:00 | 0 | 0 | 0 | 0 |
| 25.02.2019 20:00 - 21:00 | 0 | 0 | 0 | 0 |
| 25.02.2019 21:00 - 22:00 | 0 | 0 | 0 | 0 |
| 25.02.2019 22:00 - 23:00 | 0 | 0 | 0 | 0 |
| 25.02.2019 23:00 - 24:00 | 0 | -450 | 0 | 0 |
| 26.02.2019 00:00 - 01:00 | 0 | -800 | 0 | 0 |
| 26.02.2019 01:00 - 02:00 | 0 | -800 | 0 | 0 |
| 26.02.2019 02:00 - 03:00 | 0 | -800 | 0 | 0 |
| 26.02.2019 03:00 - 04:00 | 0 | -800 | 0 | 0 |
| 26.02.2019 04:00 - 05:00 | 0 | -800 | 0 | 0 |
| 26.02.2019 05:00 - 06:00 | 0 | -800 | 0 | 0 |
| 26.02.2019 06:00 - 07:00 | 0 | 0 | 0 | 0 |
| 26.02.2019 07:00 - 08:00 | 0 | 0 | 0 | 0 |
| 26.02.2019 08:00 - 09:00 | 0 | 0 | 0 | 0 |
| 26.02.2019 09:00 - 10:00 | 0 | 0 | 0 | 0 |
| 26.02.2019 10:00 - 11:00 | 0 | 0 | 0 | 0 |
| 26.02.2019 11:00 - 12:00 | 0 | 0 | 0 | 0 |
| 26.02.2019 12:00 - 13:00 | 0 | 0 | 0 | 0 |
| 26.02.2019 13:00 - 14:00 | 0 | 0 | 0 | 0 |
| 26.02.2019 14:00 - 15:00 | 0 | 0 | 0 | 0 |
| 26.02.2019 15:00 - 16:00 | 0 | 0 | 0 | 0 |
| 26.02.2019 16:00 - 17:00 | 0 | 0 | 0 | 0 |
| 26.02.2019 17:00 - 18:00 | 0 | 0 | 0 | 0 |
| 26.02.2019 18:00 - 19:00 | 0 | 0 | 0 | 0 |
| 26.02.2019 19:00 - 20:00 | 0 | 0 | 0 | 0 |
| 26.02.2019 20:00 - 21:00 | 0 | 0 | 0 | 0 |
| 26.02.2019 21:00 - 22:00 | 0 | 0 | 0 | 0 |
| 26.02.2019 22:00 - 23:00 | 0 | 0 | 0 | 0 |
| 26.02.2019 23:00 - 24:00 | 0 | 0 | 0 | 0 |
| 27.02.2019 00:00 - 01:00 | 0 | 0 | 0 | 0 |
| 27.02.2019 01:00 - 02:00 | 0 | 0 | 0 | 0 |
| 27.02.2019 02:00 - 03:00 | 0 | 0 | 0 | 0 |
| 27.02.2019 03:00 - 04:00 | 0 | 0 | 0 | 0 |
| 27.02.2019 04:00 - 05:00 | 0 | 0 | 0 | 0 |
| 27.02.2019 05:00 - 06:00 | 0 | 0 | 0 | 0 |
| 27.02.2019 06:00 - 07:00 | 0 | 0 | 0 | 0 |
| 27.02.2019 07:00 - 08:00 | 0 | 0 | 0 | 0 |
| 27.02.2019 08:00 - 09:00 | 0 | 0 | 0 | 0 |
| 27.02.2019 09:00 - 10:00 | 0 | 0 | 0 | 0 |
| 27.02.2019 10:00 - 11:00 | 0 | 0 | 0 | 0 |
| 27.02.2019 11:00 - 12:00 | 0 | 0 | 0 | 0 |
| 27.02.2019 12:00 - 13:00 | 0 | 0 | 0 | 0 |
| 27.02.2019 13:00 - 14:00 | 0 | 0 | 0 | 0 |
| 27.02.2019 14:00 - 15:00 | 0 | 0 | 0 | 0 |
| 27.02.2019 15:00 - 16:00 | 0 | 0 | 0 | 0 |
| 27.02.2019 16:00 - 17:00 | 0 | 0 | 0 | 0 |
| 27.02.2019 17:00 - 18:00 | 0 | 0 | 0 | 0 |
| 27.02.2019 18:00 - 19:00 | 0 | 0 | 0 | 0 |
| 27.02.2019 19:00 - 20:00 | 0 | 0 | 0 | 0 |
| 27.02.2019 20:00 - 21:00 | 0 | 0 | 0 | 0 |
| 27.02.2019 21:00 - 22:00 | 0 | 0 | 0 | 0 |
| 27.02.2019 22:00 - 23:00 | 0 | 0 | 0 | 0 |
| 27.02.2019 23:00 - 24:00 | 0 | 0 | 0 | 0 |
| 28.02.2019 00:00 - 01:00 | 0 | -500 | 0 | 0 |
| 28.02.2019 01:00 - 02:00 | 0 | -500 | 0 | 0 |
| 28.02.2019 02:00 - 03:00 | 0 | -500 | 0 | 0 |
| 28.02.2019 03:00 - 04:00 | 0 | -500 | 0 | 0 |
| 28.02.2019 04:00 - 05:00 | 0 | -500 | 0 | 0 |
| 28.02.2019 05:00 - 06:00 | 0 | -500 | 0 | 0 |
| 28.02.2019 06:00 - 07:00 | 0 | 0 | 0 | 0 |
| 28.02.2019 07:00 - 08:00 | 0 | 0 | 0 | 0 |
| 28.02.2019 08:00 - 09:00 | 0 | 0 | 0 | 0 |
| 28.02.2019 09:00 - 10:00 | 0 | 0 | 0 | 0 |
| 28.02.2019 10:00 - 11:00 | 0 | 0 | 0 | 0 |
| 28.02.2019 11:00 - 12:00 | 0 | 0 | 0 | 0 |
| 28.02.2019 12:00 - 13:00 | 0 | 0 | 0 | 0 |
| 28.02.2019 13:00 - 14:00 | 0 | 0 | 0 | 0 |
| 28.02.2019 14:00 - 15:00 | 0 | 0 | 0 | 0 |
| 28.02.2019 15:00 - 16:00 | 0 | 0 | 0 | 0 |
| 28.02.2019 16:00 - 17:00 | 0 | 0 | 0 | 0 |
| 28.02.2019 17:00 - 18:00 | 0 | 0 | 0 | 0 |
| 28.02.2019 18:00 - 19:00 | 0 | 0 | 0 | 0 |
| 28.02.2019 19:00 - 20:00 | 0 | 0 | 0 | 0 |
| 28.02.2019 20:00 - 21:00 | 0 | 0 | 0 | 0 |
| 28.02.2019 21:00 - 22:00 | 0 | 0 | 0 | 0 |
| 28.02.2019 22:00 - 23:00 | 0 | 0 | 0 | 0 |
| 28.02.2019 23:00 - 24:00 | 0 | 0 | 0 | 0 |
| 01.03.2019 00:00 - 01:00 | 0 | 0 | 0 | 0 |
| 01.03.2019 01:00 - 02:00 | 0 | 0 | 0 | 0 |
| 01.03.2019 02:00 - 03:00 | 0 | 0 | 0 | 0 |
| 01.03.2019 03:00 - 04:00 | 0 | 0 | 0 | 0 |
| 01.03.2019 04:00 - 05:00 | 0 | 0 | 0 | 0 |
| 01.03.2019 05:00 - 06:00 | 0 | 0 | 0 | 0 |